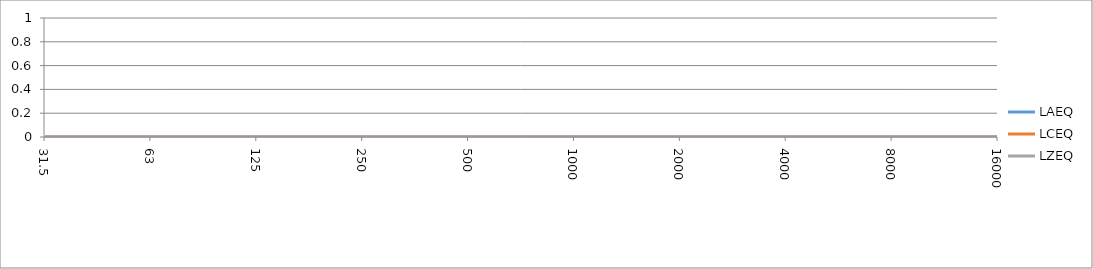
| Category | LAEQ | LCEQ | LZEQ |
|---|---|---|---|
| 31.5 | 0 | 0 | 0 |
| 63 | 0 | 0 | 0 |
| 125 | 0 | 0 | 0 |
| 250 | 0 | 0 | 0 |
| 500 | 0 | 0 | 0 |
| 1000 | 0 | 0 | 0 |
| 2000 | 0 | 0 | 0 |
| 4000 | 0 | 0 | 0 |
| 8000 | 0 | 0 | 0 |
| 16000 | 0 | 0 | 0 |